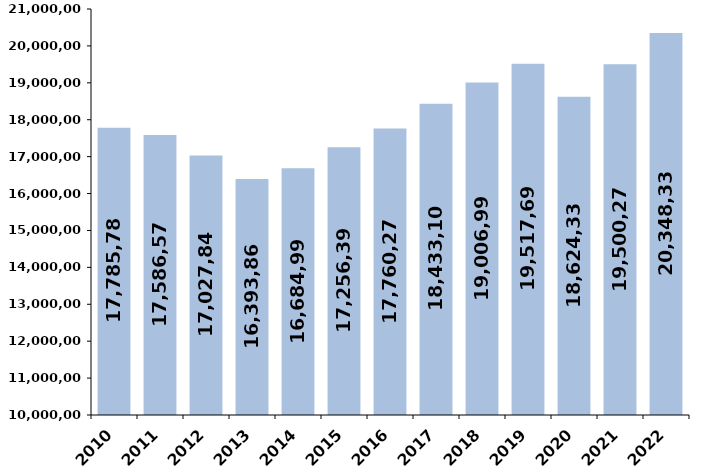
| Category | % de variación
 interanual |
|---|---|
| 2010 | 17785781.72 |
| 2011 | 17586578.68 |
| 2012 | 17027842.57 |
| 2013 | 16393865.5 |
| 2014 | 16684995.09 |
| 2015 | 17256395.45 |
| 2016 | 17760271.11 |
| 2017 | 18433106.51 |
| 2018 | 19006990.19 |
| 2019 | 19517697.2 |
| 2020 | 18624337 |
| 2021 | 19500277 |
| 2022 | 20348329.955 |